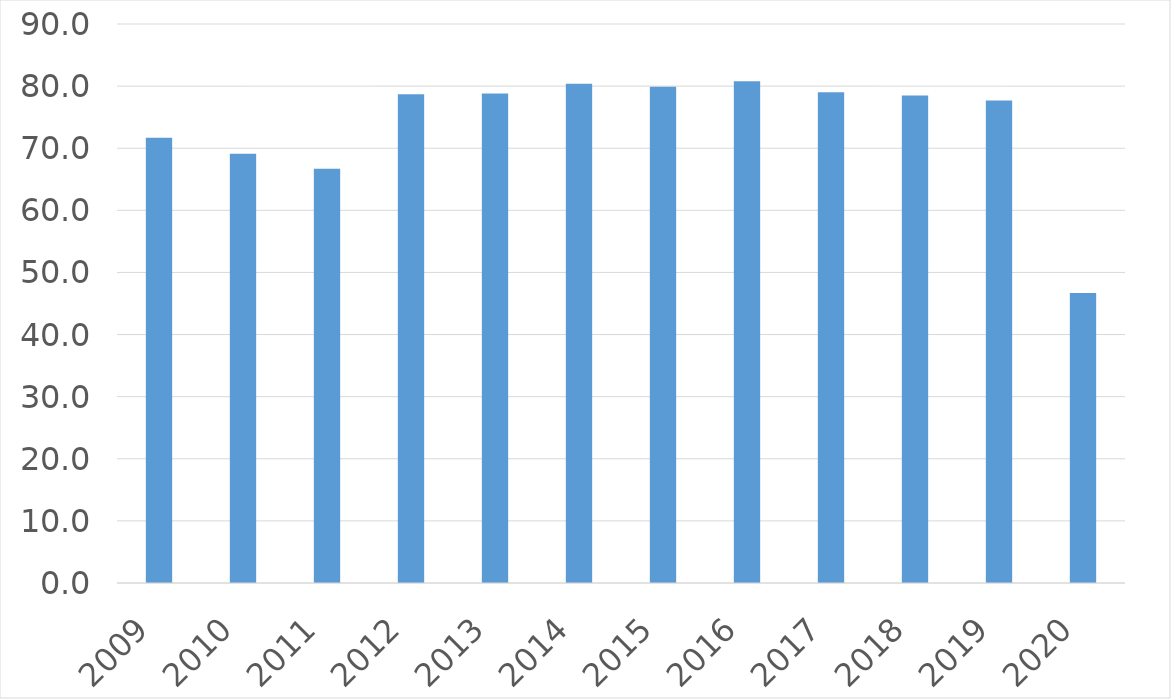
| Category | Series 0 |
|---|---|
| 2009 | 71.7 |
| 2010 | 69.1 |
| 2011 | 66.7 |
| 2012 | 78.7 |
| 2013 | 78.8 |
| 2014 | 80.4 |
| 2015 | 79.9 |
| 2016 | 80.8 |
| 2017 | 79 |
| 2018 | 78.5 |
| 2019 | 77.7 |
| 2020 | 46.7 |